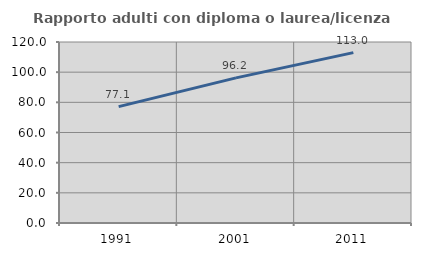
| Category | Rapporto adulti con diploma o laurea/licenza media  |
|---|---|
| 1991.0 | 77.129 |
| 2001.0 | 96.226 |
| 2011.0 | 112.968 |